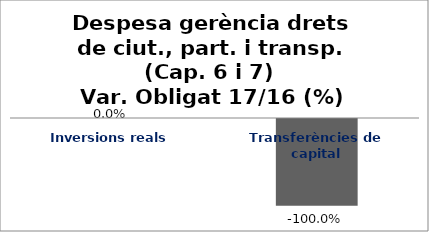
| Category | Series 0 |
|---|---|
| Inversions reals | 0 |
| Transferències de capital | -1 |